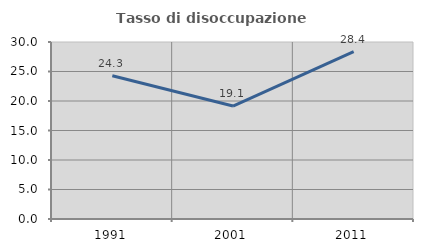
| Category | Tasso di disoccupazione giovanile  |
|---|---|
| 1991.0 | 24.269 |
| 2001.0 | 19.149 |
| 2011.0 | 28.384 |